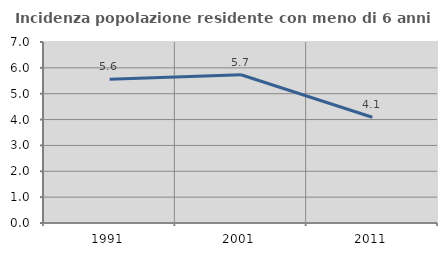
| Category | Incidenza popolazione residente con meno di 6 anni |
|---|---|
| 1991.0 | 5.558 |
| 2001.0 | 5.735 |
| 2011.0 | 4.091 |